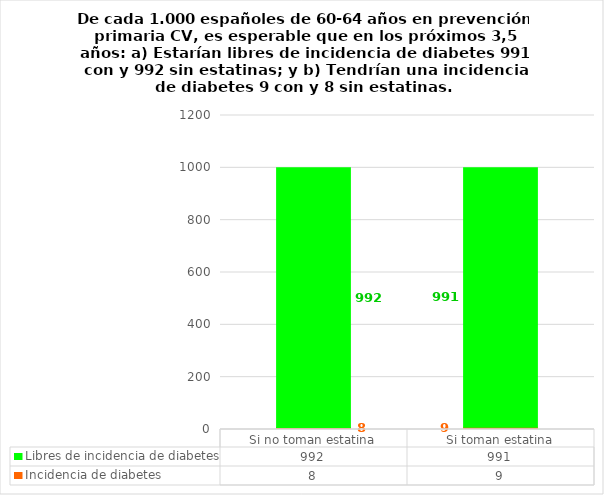
| Category | Incidencia de diabetes | Libres de incidencia de diabetes |
|---|---|---|
| Si no toman estatina | 8 | 992 |
| Si toman estatina | 9 | 991 |